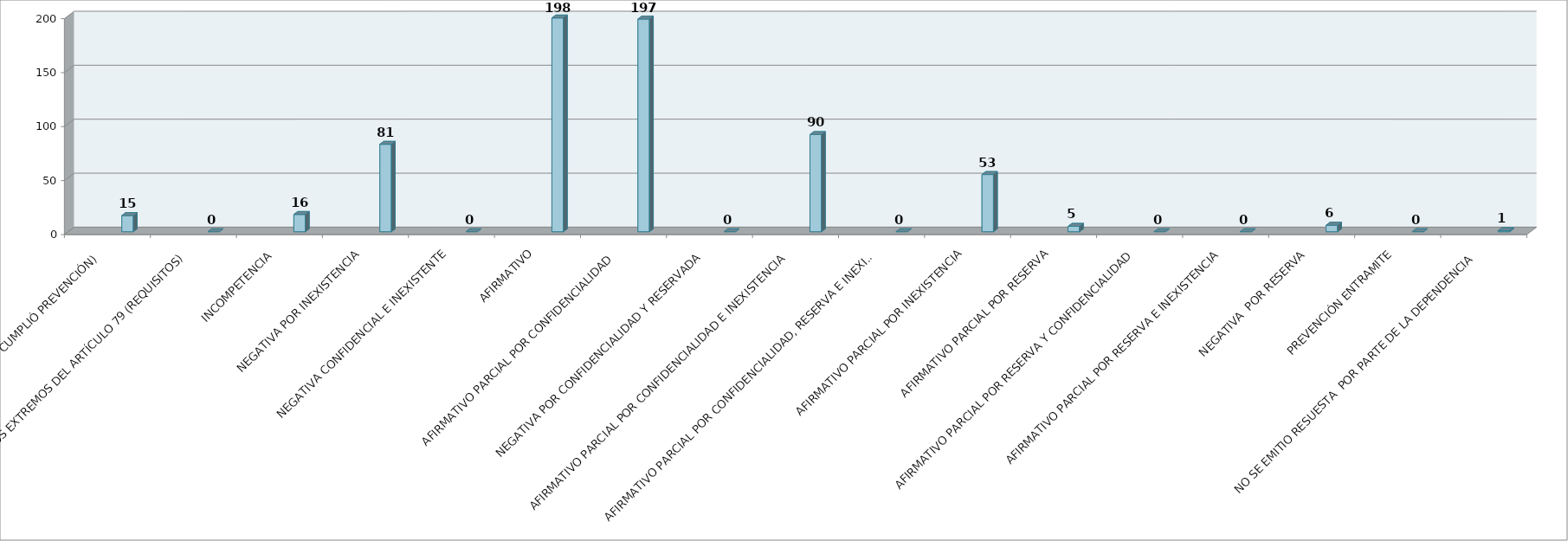
| Category | Series 0 | Series 1 | Series 2 | Series 3 | Series 4 | Series 5 |
|---|---|---|---|---|---|---|
| SE TIENE POR NO PRESENTADA ( NO CUMPLIÓ PREVENCIÓN) |  |  |  |  | 15 |  |
| NO CUMPLIO CON LOS EXTREMOS DEL ARTÍCULO 79 (REQUISITOS) |  |  |  |  | 0 |  |
| INCOMPETENCIA  |  |  |  |  | 16 |  |
| NEGATIVA POR INEXISTENCIA |  |  |  |  | 81 |  |
| NEGATIVA CONFIDENCIAL E INEXISTENTE |  |  |  |  | 0 |  |
| AFIRMATIVO |  |  |  |  | 198 |  |
| AFIRMATIVO PARCIAL POR CONFIDENCIALIDAD  |  |  |  |  | 197 |  |
| NEGATIVA POR CONFIDENCIALIDAD Y RESERVADA |  |  |  |  | 0 |  |
| AFIRMATIVO PARCIAL POR CONFIDENCIALIDAD E INEXISTENCIA |  |  |  |  | 90 |  |
| AFIRMATIVO PARCIAL POR CONFIDENCIALIDAD, RESERVA E INEXISTENCIA |  |  |  |  | 0 |  |
| AFIRMATIVO PARCIAL POR INEXISTENCIA |  |  |  |  | 53 |  |
| AFIRMATIVO PARCIAL POR RESERVA |  |  |  |  | 5 |  |
| AFIRMATIVO PARCIAL POR RESERVA Y CONFIDENCIALIDAD |  |  |  |  | 0 |  |
| AFIRMATIVO PARCIAL POR RESERVA E INEXISTENCIA |  |  |  |  | 0 |  |
| NEGATIVA  POR RESERVA |  |  |  |  | 6 |  |
| PREVENCIÓN ENTRAMITE |  |  |  |  | 0 |  |
| NO SE EMITIO RESUESTA  POR PARTE DE LA DEPENDENCIA |  |  |  |  | 1 |  |